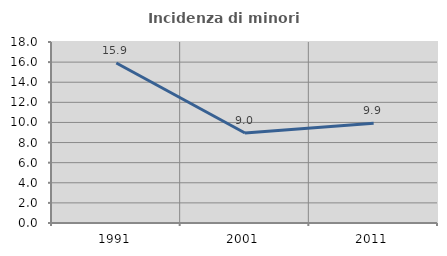
| Category | Incidenza di minori stranieri |
|---|---|
| 1991.0 | 15.909 |
| 2001.0 | 8.955 |
| 2011.0 | 9.917 |